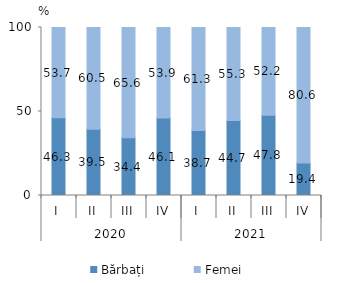
| Category | Bărbați | Femei |
|---|---|---|
| 0 | 46.3 | 53.7 |
| 1 | 39.5 | 60.5 |
| 2 | 34.4 | 65.6 |
| 3 | 46.1 | 53.9 |
| 4 | 38.7 | 61.3 |
| 5 | 44.7 | 55.3 |
| 6 | 47.8 | 52.2 |
| 7 | 19.4 | 80.6 |